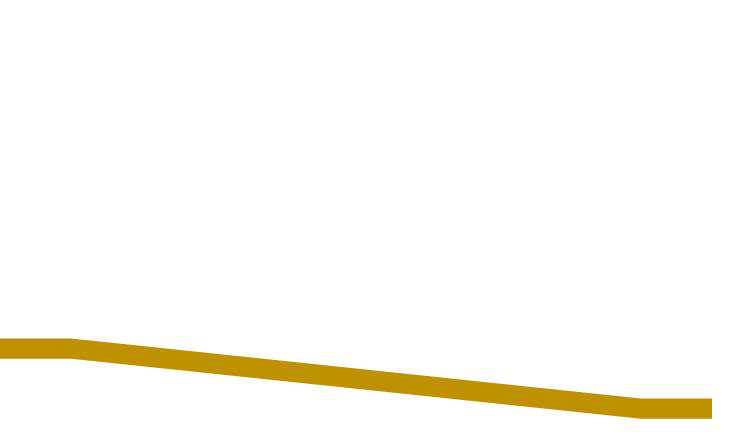
| Category | Series 0 | Series 1 | Series 2 |
|---|---|---|---|
| 0.0 | 3193.711 | 193.3 | 626.149 |
| 10.0 | 3193.711 | 193.3 | 626.149 |
| 90.0 | 3770.027 | 193.3 | 49.833 |
| 100.0 | 3770.027 | 193.3 | 49.833 |